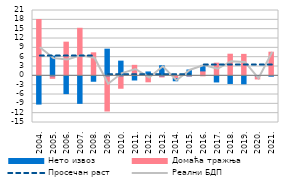
| Category | Домаћа тражњa | Нето извоз |
|---|---|---|
| 2004. | 18.107 | -9.078 |
| 2005. | -0.796 | 6.327 |
| 2006. | 10.824 | -5.716 |
| 2007. | 15.288 | -8.849 |
| 2008. | 7.398 | -1.742 |
| 2009. | -11.301 | 8.569 |
| 2010. | -3.992 | 4.723 |
| 2011. | 3.374 | -1.338 |
| 2012. | -1.923 | 1.242 |
| 2013. | -0.357 | 3.249 |
| 2014. | -0.864 | -0.725 |
| 2015. | -0.072 | 1.878 |
| 2016. | 1.583 | 1.755 |
| 2017. | 4.068 | -1.966 |
| 2018. | 6.95 | -2.455 |
| 2019. | 6.9 | -2.559 |
| 2020. | -1 | 0.1 |
| 2021. | 7.6 | -0.1 |